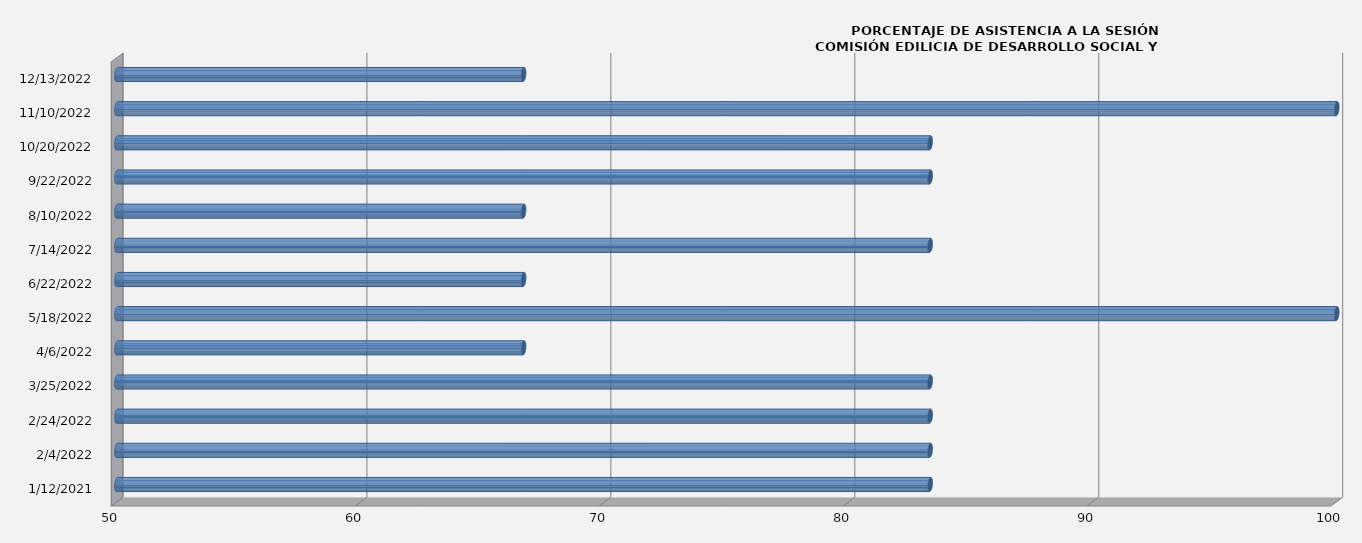
| Category | Series 0 |
|---|---|
| 1/12/21 | 83.333 |
| 2/4/22 | 83.333 |
| 2/24/22 | 83.333 |
| 3/25/22 | 83.333 |
| 4/6/22 | 66.667 |
| 5/18/22 | 100 |
| 6/22/22 | 66.667 |
| 7/14/22 | 83.333 |
| 8/10/22 | 66.667 |
| 9/22/22 | 83.333 |
| 10/20/22 | 83.333 |
| 11/10/22 | 100 |
| 12/13/22 | 66.667 |